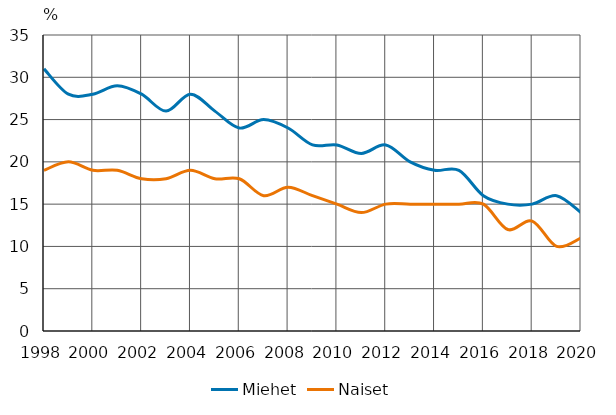
| Category | Miehet | Naiset |
|---|---|---|
| 1998.0 | 31 | 19 |
| 1999.0 | 28 | 20 |
| 2000.0 | 28 | 19 |
| 2001.0 | 29 | 19 |
| 2002.0 | 28 | 18 |
| 2003.0 | 26 | 18 |
| 2004.0 | 28 | 19 |
| 2005.0 | 26 | 18 |
| 2006.0 | 24 | 18 |
| 2007.0 | 25 | 16 |
| 2008.0 | 24 | 17 |
| 2009.0 | 22 | 16 |
| 2010.0 | 22 | 15 |
| 2011.0 | 21 | 14 |
| 2012.0 | 22 | 15 |
| 2013.0 | 20 | 15 |
| 2014.0 | 19 | 15 |
| 2015.0 | 19 | 15 |
| 2016.0 | 16 | 15 |
| 2017.0 | 15 | 12 |
| 2018.0 | 15 | 13 |
| 2019.0 | 16 | 10 |
| 2020.0 | 14 | 11 |